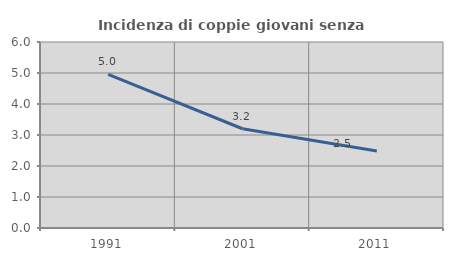
| Category | Incidenza di coppie giovani senza figli |
|---|---|
| 1991.0 | 4.954 |
| 2001.0 | 3.202 |
| 2011.0 | 2.486 |